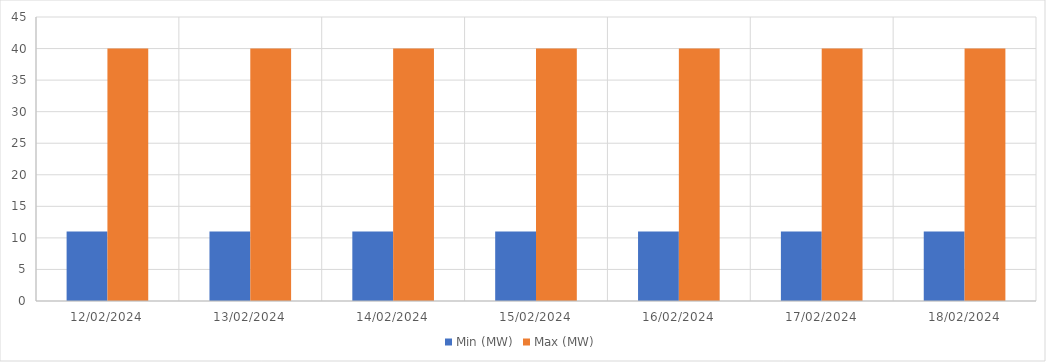
| Category | Min (MW) | Max (MW) |
|---|---|---|
| 12/02/2024 | 11 | 40 |
| 13/02/2024 | 11 | 40 |
| 14/02/2024 | 11 | 40 |
| 15/02/2024 | 11 | 40 |
| 16/02/2024 | 11 | 40 |
| 17/02/2024 | 11 | 40 |
| 18/02/2024 | 11 | 40 |